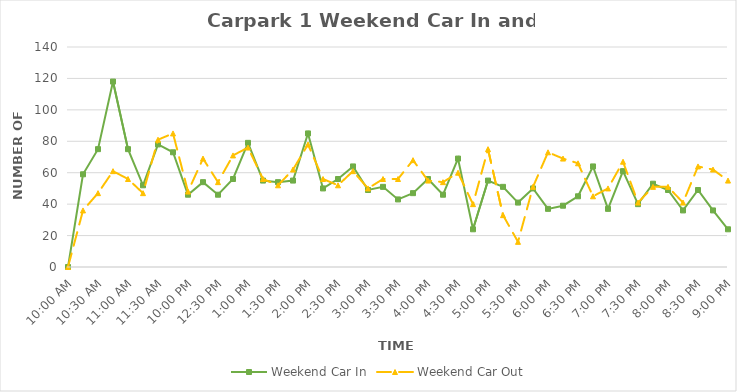
| Category | Weekend Car In | Weekend Car Out |
|---|---|---|
| 0.4166666666666667 | 0 | 0 |
| 0.4270833333333333 | 59 | 36 |
| 0.4375 | 75 | 47 |
| 0.4479166666666667 | 118 | 61 |
| 0.4583333333333333 | 75 | 56 |
| 0.46875 | 52 | 47 |
| 0.4791666666666667 | 78 | 81 |
| 0.4895833333333333 | 73 | 85 |
| 0.5 | 46 | 48 |
| 0.5104166666666666 | 54 | 69 |
| 0.5208333333333334 | 46 | 54 |
| 0.53125 | 56 | 71 |
| 0.5416666666666666 | 79 | 76 |
| 0.5520833333333334 | 55 | 56 |
| 0.5625 | 54 | 52 |
| 0.5729166666666666 | 55 | 62 |
| 0.5833333333333334 | 85 | 78 |
| 0.59375 | 50 | 56 |
| 0.604166666666667 | 56 | 52 |
| 0.614583333333334 | 64 | 61 |
| 0.625 | 49 | 50 |
| 0.635416666666667 | 51 | 56 |
| 0.645833333333334 | 43 | 56 |
| 0.656250000000001 | 47 | 68 |
| 0.666666666666667 | 56 | 55 |
| 0.677083333333334 | 46 | 54 |
| 0.687500000000001 | 69 | 60 |
| 0.697916666666668 | 24 | 40 |
| 0.708333333333335 | 55 | 75 |
| 0.718750000000002 | 51 | 33 |
| 0.729166666666669 | 41 | 16 |
| 0.739583333333336 | 50 | 51 |
| 0.75 | 37 | 73 |
| 0.7604166666666666 | 39 | 69 |
| 0.7708333333333334 | 45 | 66 |
| 0.78125 | 64 | 45 |
| 0.7916666666666666 | 37 | 50 |
| 0.8020833333333334 | 61 | 67 |
| 0.8125 | 40 | 41 |
| 0.8229166666666666 | 53 | 51 |
| 0.8333333333333334 | 49 | 51 |
| 0.84375 | 36 | 41 |
| 0.8541666666666666 | 49 | 64 |
| 0.8645833333333334 | 36 | 62 |
| 0.875 | 24 | 55 |